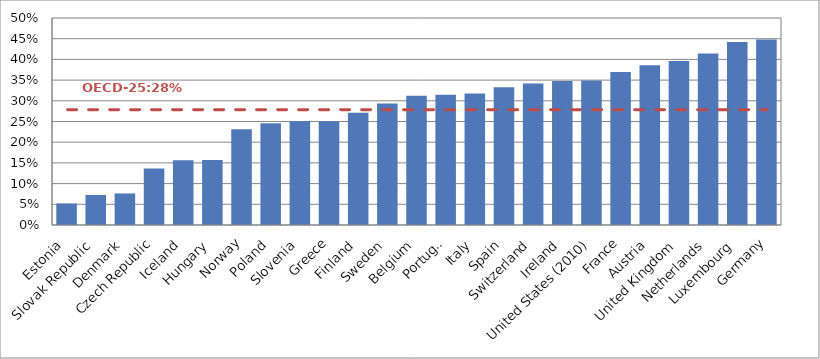
| Category | Series 0 |
|---|---|
| Estonia | 0.052 |
| Slovak Republic | 0.072 |
| Denmark | 0.076 |
| Czech Republic | 0.137 |
| Iceland | 0.156 |
| Hungary | 0.157 |
| Norway | 0.231 |
| Poland | 0.246 |
| Slovenia | 0.25 |
| Greece | 0.251 |
| Finland | 0.271 |
| Sweden | 0.294 |
| Belgium | 0.312 |
| Portugal | 0.315 |
| Italy | 0.318 |
| Spain | 0.333 |
| Switzerland | 0.342 |
| Ireland | 0.348 |
| United States (2010) | 0.349 |
| France | 0.37 |
| Austria | 0.386 |
| United Kingdom | 0.396 |
| Netherlands | 0.414 |
| Luxembourg | 0.442 |
| Germany | 0.448 |